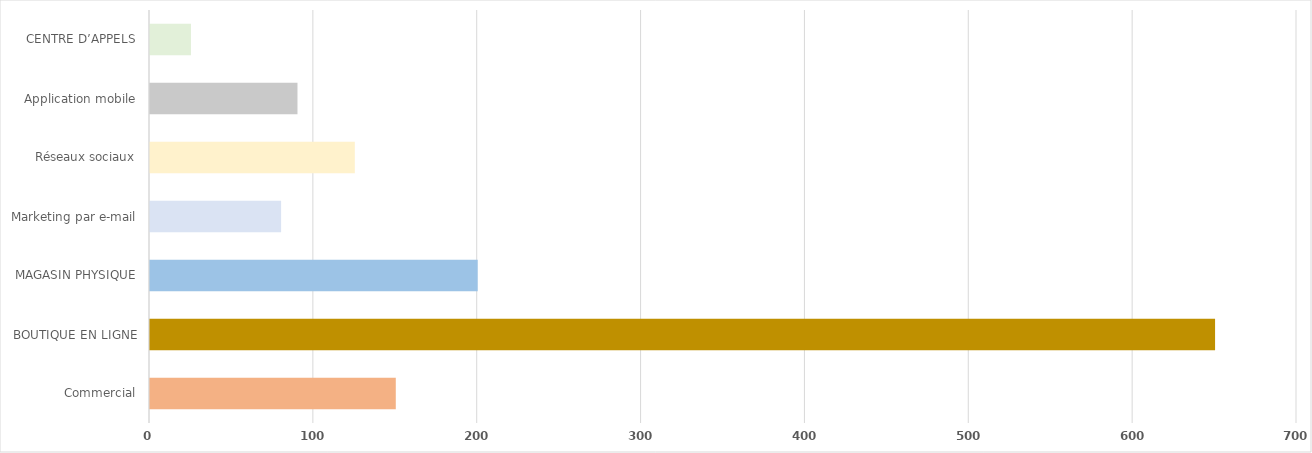
| Category | Series 0 |
|---|---|
| Commercial | 150 |
| BOUTIQUE EN LIGNE | 650 |
| MAGASIN PHYSIQUE | 200 |
| Marketing par e-mail | 80 |
| Réseaux sociaux | 125 |
| Application mobile | 90 |
| CENTRE D’APPELS | 25 |